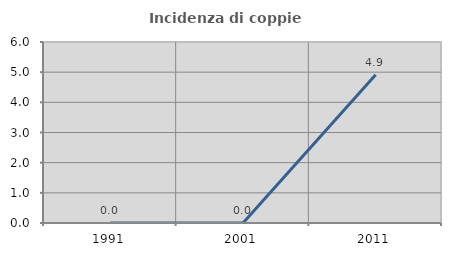
| Category | Incidenza di coppie miste |
|---|---|
| 1991.0 | 0 |
| 2001.0 | 0 |
| 2011.0 | 4.918 |